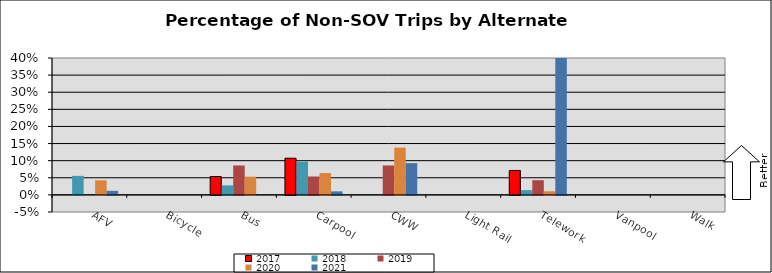
| Category | 2017 | 2018 | 2019 | 2020 | 2021 |
|---|---|---|---|---|---|
| AFV | 0 | 0.056 | 0 | 0.043 | 0.012 |
| Bicycle | 0 | 0 | 0 | 0 | 0 |
| Bus | 0.054 | 0.028 | 0.086 | 0.053 | 0 |
| Carpool | 0.107 | 0.097 | 0.054 | 0.064 | 0.01 |
| CWW | 0 | 0 | 0.086 | 0.138 | 0.093 |
| Light Rail | 0 | 0 | 0 | 0 | 0 |
| Telework | 0.071 | 0.014 | 0.043 | 0.011 | 0.536 |
| Vanpool | 0 | 0 | 0 | 0 | 0 |
| Walk | 0 | 0 | 0 | 0 | 0 |